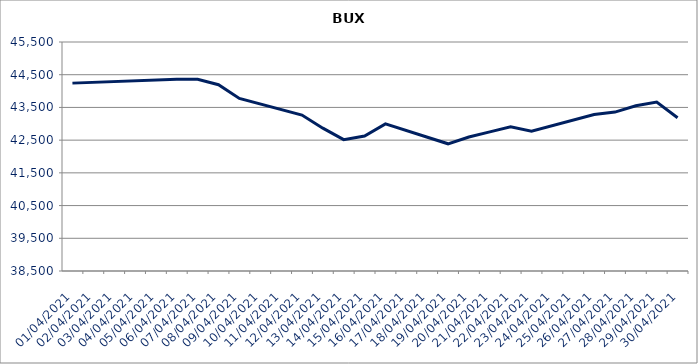
| Category | Series 0 |
|---|---|
| 01/04/2021 | 44242.93 |
| 06/04/2021 | 44357.86 |
| 07/04/2021 | 44357.64 |
| 08/04/2021 | 44194.16 |
| 09/04/2021 | 43775.41 |
| 12/04/2021 | 43267.25 |
| 13/04/2021 | 42865.63 |
| 14/04/2021 | 42514.94 |
| 15/04/2021 | 42626.71 |
| 16/04/2021 | 42997.61 |
| 19/04/2021 | 42388.09 |
| 20/04/2021 | 42597.26 |
| 21/04/2021 | 42753.6 |
| 22/04/2021 | 42906.48 |
| 23/04/2021 | 42772.95 |
| 26/04/2021 | 43281.61 |
| 27/04/2021 | 43357.19 |
| 28/04/2021 | 43549.43 |
| 29/04/2021 | 43665.42 |
| 30/04/2021 | 43183.2 |